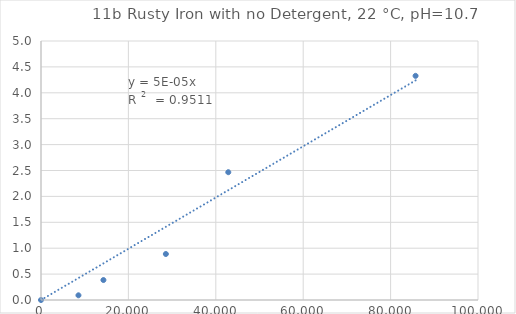
| Category | Series 0 |
|---|---|
| 0.0 | 0 |
| 8571.428571428572 | 0.091 |
| 14285.714285714286 | 0.385 |
| 28571.428571428572 | 0.888 |
| 42857.14285714286 | 2.467 |
| 85714.28571428572 | 4.327 |